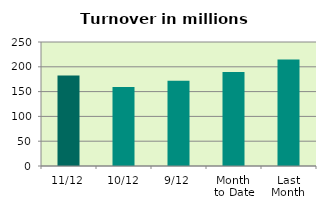
| Category | Series 0 |
|---|---|
| 11/12 | 182.614 |
| 10/12 | 159.087 |
| 9/12 | 171.991 |
| Month 
to Date | 189.507 |
| Last
Month | 214.794 |